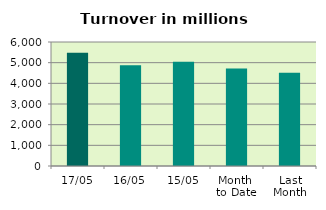
| Category | Series 0 |
|---|---|
| 17/05 | 5481.381 |
| 16/05 | 4877.022 |
| 15/05 | 5043.834 |
| Month 
to Date | 4720.532 |
| Last
Month | 4514.737 |